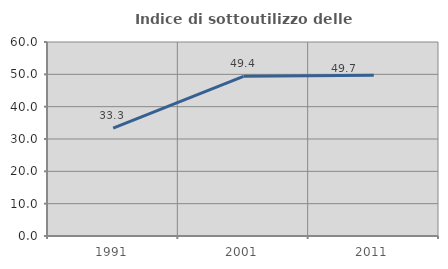
| Category | Indice di sottoutilizzo delle abitazioni  |
|---|---|
| 1991.0 | 33.333 |
| 2001.0 | 49.383 |
| 2011.0 | 49.686 |